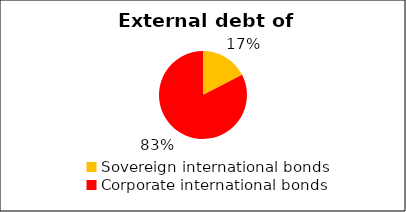
| Category | International bond market volume |
|---|---|
| Sovereign international bonds | 0.5 |
| Corporate international bonds | 2.375 |